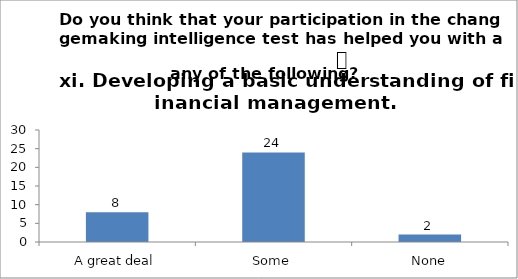
| Category | Do you think that your participation in the changemaking intelligence test has helped you with any of the following?
xi. Developing a basic understanding of financial management. |
|---|---|
| A great deal | 8 |
| Some | 24 |
| None | 2 |